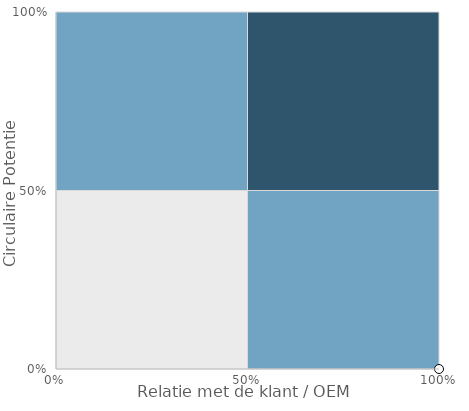
| Category | XX |
|---|---|
| 1.0 | 0 |